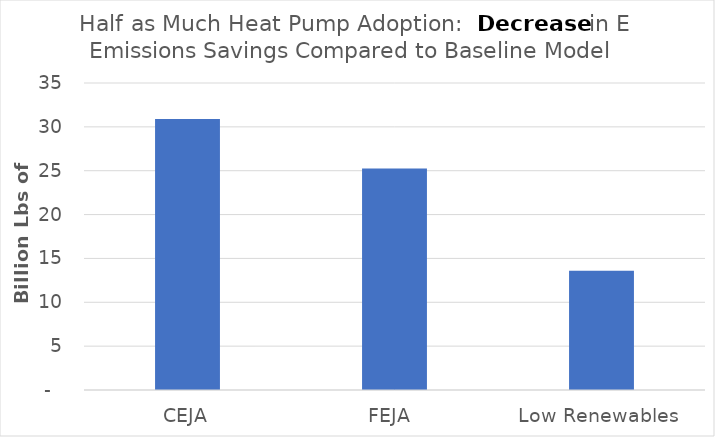
| Category | Decrease in Emissions Savings Compared to Baseline Model |
|---|---|
| CEJA | 30891848632.061 |
| FEJA  | 25260678483.762 |
| Low Renewables  | 13608176990.57 |